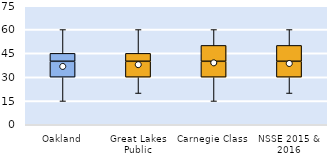
| Category | 25th | 50th | 75th |
|---|---|---|---|
| Oakland | 30 | 10 | 5 |
| Great Lakes Public | 30 | 10 | 5 |
| Carnegie Class | 30 | 10 | 10 |
| NSSE 2015 & 2016 | 30 | 10 | 10 |